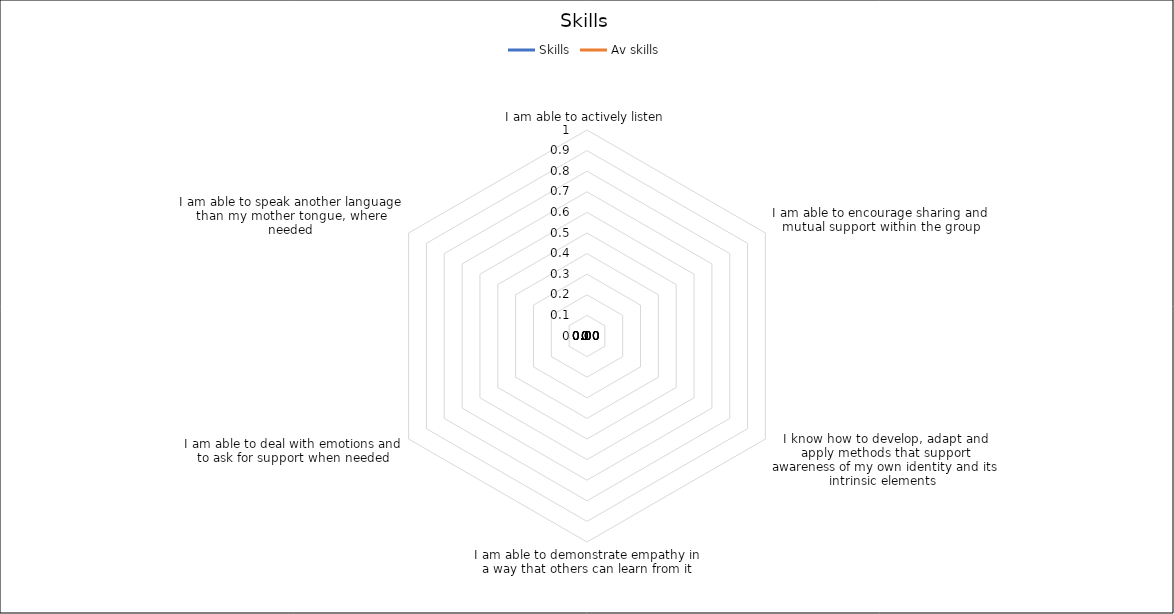
| Category | Skills | Av skills |
|---|---|---|
| I am able to actively listen | 0 | 0 |
| I am able to encourage sharing and mutual support within the group | 0 | 0 |
| I know how to develop, adapt and apply methods that support awareness of my own identity and its intrinsic elements  | 0 | 0 |
| I am able to demonstrate empathy in a way that others can learn from it | 0 | 0 |
| I am able to deal with emotions and to ask for support when needed | 0 | 0 |
| I am able to speak another language than my mother tongue, where needed | 0 | 0 |